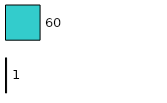
| Category | Series 0 | Series 1 |
|---|---|---|
| 0 | 1 | 60 |